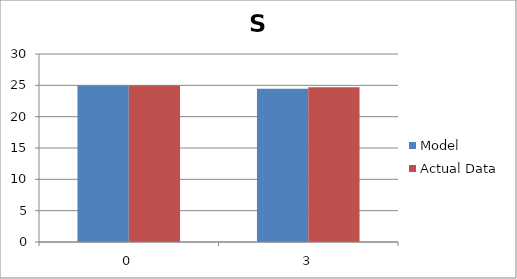
| Category | Model | Actual Data |
|---|---|---|
| 0.0 | 24.98 | 24.98 |
| 3.0 | 24.47 | 24.7 |